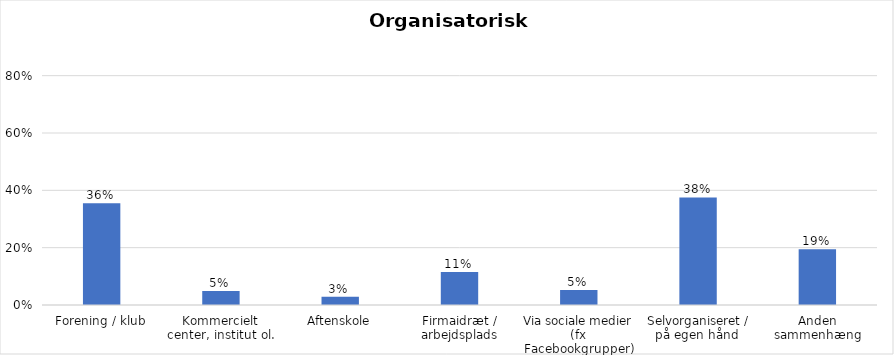
| Category | % |
|---|---|
| Forening / klub | 0.355 |
| Kommercielt center, institut ol. | 0.049 |
| Aftenskole | 0.029 |
| Firmaidræt / arbejdsplads | 0.115 |
| Via sociale medier (fx Facebookgrupper) | 0.052 |
| Selvorganiseret / på egen hånd  | 0.375 |
| Anden sammenhæng | 0.194 |